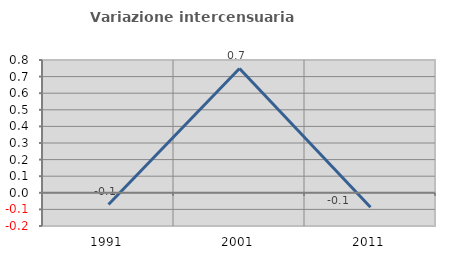
| Category | Variazione intercensuaria annua |
|---|---|
| 1991.0 | -0.07 |
| 2001.0 | 0.749 |
| 2011.0 | -0.087 |